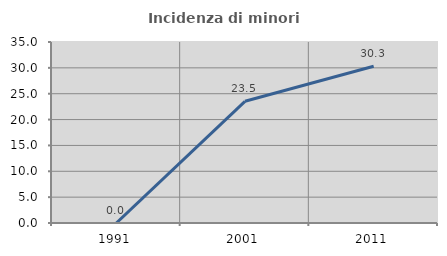
| Category | Incidenza di minori stranieri |
|---|---|
| 1991.0 | 0 |
| 2001.0 | 23.529 |
| 2011.0 | 30.303 |